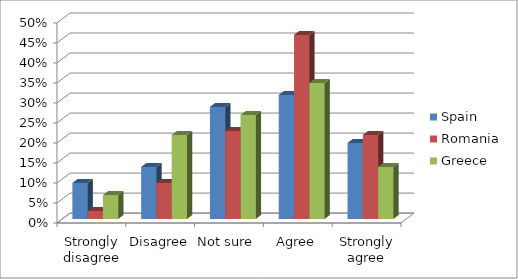
| Category | Spain | Romania | Greece |
|---|---|---|---|
| Strongly disagree | 0.09 | 0.02 | 0.06 |
| Disagree | 0.13 | 0.09 | 0.21 |
| Not sure  | 0.28 | 0.22 | 0.26 |
| Agree | 0.31 | 0.46 | 0.34 |
| Strongly agree | 0.19 | 0.21 | 0.13 |